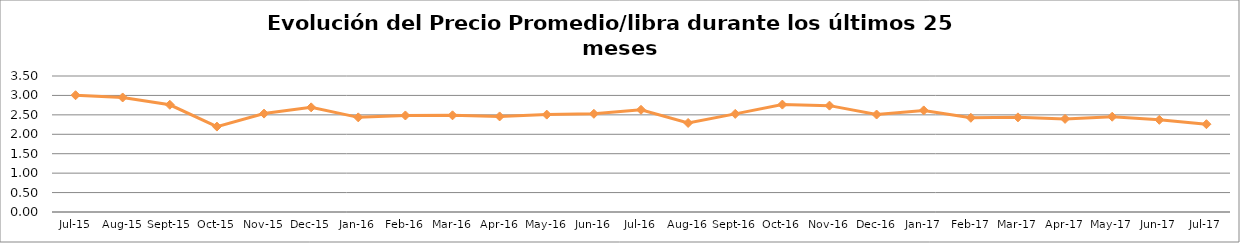
| Category | Series 0 |
|---|---|
| 2015-07-01 | 3.005 |
| 2015-08-01 | 2.947 |
| 2015-09-01 | 2.76 |
| 2015-10-01 | 2.198 |
| 2015-11-01 | 2.532 |
| 2015-12-01 | 2.693 |
| 2016-01-01 | 2.436 |
| 2016-02-01 | 2.484 |
| 2016-03-01 | 2.488 |
| 2016-04-01 | 2.46 |
| 2016-05-01 | 2.506 |
| 2016-06-01 | 2.527 |
| 2016-07-01 | 2.631 |
| 2016-08-01 | 2.292 |
| 2016-09-01 | 2.525 |
| 2016-10-01 | 2.764 |
| 2016-11-01 | 2.737 |
| 2016-12-01 | 2.508 |
| 2017-01-01 | 2.615 |
| 2017-02-01 | 2.424 |
| 2017-03-01 | 2.436 |
| 2017-04-01 | 2.396 |
| 2017-05-01 | 2.452 |
| 2017-06-01 | 2.372 |
| 2017-07-01 | 2.26 |